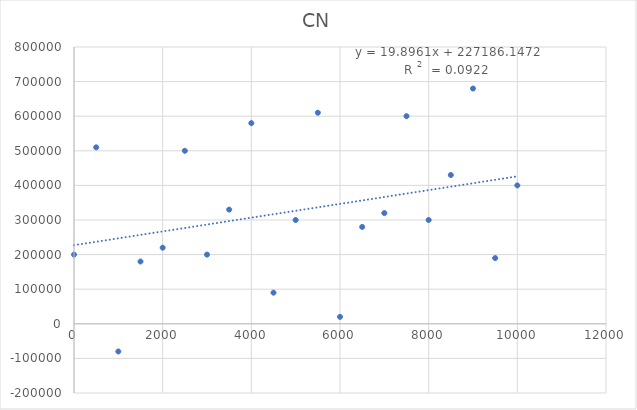
| Category | CN |
|---|---|
| 0.0 | 200000 |
| 500.0 | 510000 |
| 1000.0 | -80000 |
| 1500.0 | 180000 |
| 2000.0 | 220000 |
| 2500.0 | 500000 |
| 3000.0 | 200000 |
| 3500.0 | 330000 |
| 4000.0 | 580000 |
| 4500.0 | 90000 |
| 5000.0 | 300000 |
| 5500.0 | 610000 |
| 6000.0 | 20000 |
| 6500.0 | 280000 |
| 7000.0 | 320000 |
| 7500.0 | 600000 |
| 8000.0 | 300000 |
| 8500.0 | 430000 |
| 9000.0 | 680000 |
| 9500.0 | 190000 |
| 10000.0 | 400000 |